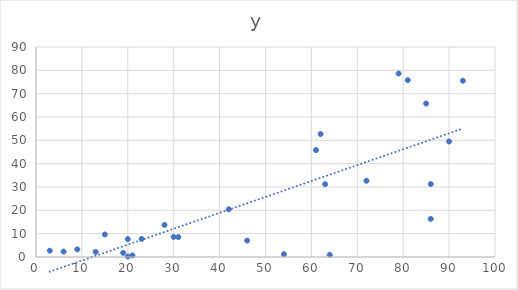
| Category | y |
|---|---|
| 54.0 | 1.2 |
| 93.0 | 75.537 |
| 90.0 | 49.521 |
| 28.0 | 13.734 |
| 64.0 | 0.925 |
| 81.0 | 75.78 |
| 20.0 | 7.676 |
| 79.0 | 78.633 |
| 62.0 | 52.697 |
| 63.0 | 31.206 |
| 3.0 | 2.711 |
| 61.0 | 45.834 |
| 30.0 | 8.597 |
| 42.0 | 20.446 |
| 86.0 | 31.253 |
| 15.0 | 9.663 |
| 20.0 | 0.195 |
| 46.0 | 7.028 |
| 31.0 | 8.53 |
| 9.0 | 3.271 |
| 72.0 | 32.667 |
| 13.0 | 2.181 |
| 86.0 | 16.33 |
| 19.0 | 1.738 |
| 23.0 | 7.736 |
| 21.0 | 0.684 |
| 85.0 | 65.773 |
| 6.0 | 2.335 |